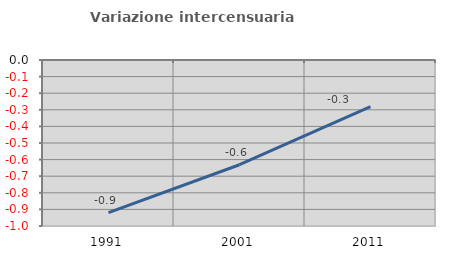
| Category | Variazione intercensuaria annua |
|---|---|
| 1991.0 | -0.92 |
| 2001.0 | -0.631 |
| 2011.0 | -0.28 |